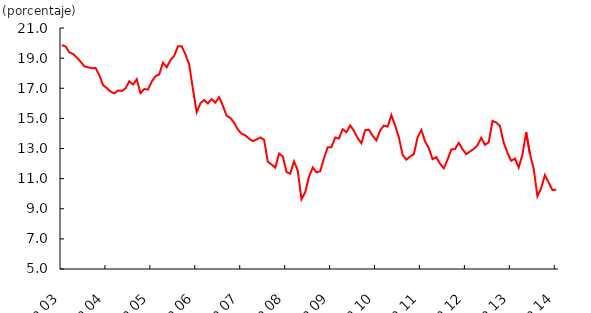
| Category | Últimos 5 años |
|---|---|
| 2003-01-01 | 20.53 |
| 2003-02-01 | 20.48 |
| 2003-03-01 | 20.17 |
| 2003-04-01 | 19.93 |
| 2003-05-01 | 19.92 |
| 2003-06-01 | 19.87 |
| 2003-07-01 | 19.77 |
| 2003-08-01 | 19.38 |
| 2003-09-01 | 19.28 |
| 2003-10-01 | 19.04 |
| 2003-11-01 | 18.76 |
| 2003-12-01 | 18.46 |
| 2004-01-01 | 18.39 |
| 2004-02-01 | 18.33 |
| 2004-03-01 | 18.34 |
| 2004-04-01 | 17.87 |
| 2004-05-01 | 17.21 |
| 2004-06-01 | 17.01 |
| 2004-07-01 | 16.78 |
| 2004-08-01 | 16.66 |
| 2004-09-01 | 16.85 |
| 2004-10-01 | 16.82 |
| 2004-11-01 | 16.99 |
| 2004-12-01 | 17.46 |
| 2005-01-01 | 17.25 |
| 2005-02-01 | 17.6 |
| 2005-03-01 | 16.67 |
| 2005-04-01 | 16.95 |
| 2005-05-01 | 16.91 |
| 2005-06-01 | 17.44 |
| 2005-07-01 | 17.8 |
| 2005-08-01 | 17.92 |
| 2005-09-01 | 18.7 |
| 2005-10-01 | 18.39 |
| 2005-11-01 | 18.87 |
| 2005-12-01 | 19.15 |
| 2006-01-01 | 19.79 |
| 2006-02-01 | 19.79 |
| 2006-03-01 | 19.25 |
| 2006-04-01 | 18.58 |
| 2006-05-01 | 16.94 |
| 2006-06-01 | 15.41 |
| 2006-07-01 | 16 |
| 2006-08-01 | 16.22 |
| 2006-09-01 | 15.99 |
| 2006-10-01 | 16.28 |
| 2006-11-01 | 16.04 |
| 2006-12-01 | 16.4 |
| 2007-01-01 | 15.84 |
| 2007-02-01 | 15.17 |
| 2007-03-01 | 15.03 |
| 2007-04-01 | 14.71 |
| 2007-05-01 | 14.26 |
| 2007-06-01 | 13.98 |
| 2007-07-01 | 13.87 |
| 2007-08-01 | 13.65 |
| 2007-09-01 | 13.49 |
| 2007-10-01 | 13.6 |
| 2007-11-01 | 13.73 |
| 2007-12-01 | 13.58 |
| 2008-01-01 | 12.12 |
| 2008-02-01 | 11.94 |
| 2008-03-01 | 11.73 |
| 2008-04-01 | 12.66 |
| 2008-05-01 | 12.473 |
| 2008-06-01 | 11.44 |
| 2008-07-01 | 11.336 |
| 2008-08-01 | 12.149 |
| 2008-09-01 | 11.53 |
| 2008-10-01 | 9.624 |
| 2008-11-01 | 10.1 |
| 2008-12-01 | 11.13 |
| 2009-01-01 | 11.74 |
| 2009-02-01 | 11.416 |
| 2009-03-01 | 11.492 |
| 2009-04-01 | 12.349 |
| 2009-05-01 | 13.09 |
| 2009-06-01 | 13.09 |
| 2009-07-01 | 13.727 |
| 2009-08-01 | 13.661 |
| 2009-09-01 | 14.277 |
| 2009-10-01 | 14.08 |
| 2009-11-01 | 14.533 |
| 2009-12-01 | 14.17 |
| 2010-01-01 | 13.689 |
| 2010-02-01 | 13.347 |
| 2010-03-01 | 14.213 |
| 2010-04-01 | 14.242 |
| 2010-05-01 | 13.846 |
| 2010-06-01 | 13.532 |
| 2010-07-01 | 14.204 |
| 2010-08-01 | 14.522 |
| 2010-09-01 | 14.451 |
| 2010-10-01 | 15.216 |
| 2010-11-01 | 14.522 |
| 2010-12-01 | 13.744 |
| 2011-01-01 | 12.572 |
| 2011-02-01 | 12.26 |
| 2011-03-01 | 12.467 |
| 2011-04-01 | 12.616 |
| 2011-05-01 | 13.74 |
| 2011-06-01 | 14.228 |
| 2011-07-01 | 13.473 |
| 2011-08-01 | 13.022 |
| 2011-09-01 | 12.289 |
| 2011-10-01 | 12.428 |
| 2011-11-01 | 11.99 |
| 2011-12-01 | 11.686 |
| 2012-01-01 | 12.261 |
| 2012-02-01 | 12.936 |
| 2012-03-01 | 12.962 |
| 2012-04-01 | 13.372 |
| 2012-05-01 | 12.961 |
| 2012-06-01 | 12.62 |
| 2012-07-01 | 12.804 |
| 2012-08-01 | 12.967 |
| 2012-09-01 | 13.21 |
| 2012-10-01 | 13.707 |
| 2012-11-01 | 13.241 |
| 2012-12-01 | 13.409 |
| 2013-01-01 | 14.831 |
| 2013-02-01 | 14.728 |
| 2013-03-01 | 14.488 |
| 2013-04-01 | 13.386 |
| 2013-05-01 | 12.72 |
| 2013-06-01 | 12.18 |
| 2013-07-01 | 12.33 |
| 2013-08-01 | 11.74 |
| 2013-09-01 | 12.59 |
| 2013-10-01 | 14.08 |
| 2013-11-01 | 12.64 |
| 2013-12-01 | 11.67 |
| 2014-01-01 | 9.83 |
| 2014-02-01 | 10.36 |
| 2014-03-01 | 11.24 |
| 2014-04-01 | 10.75 |
| 2014-05-01 | 10.24 |
| 2014-06-01 | 10.28 |